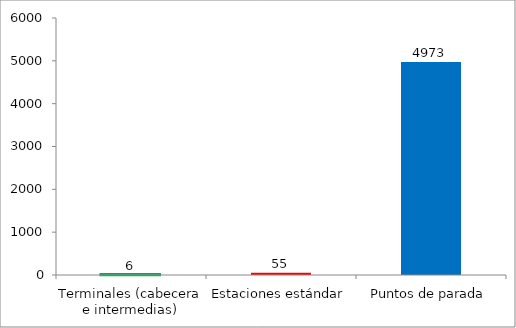
| Category | Series 0 |
|---|---|
| Terminales (cabecera e intermedias) | 6 |
| Estaciones estándar | 55 |
| Puntos de parada | 4973 |